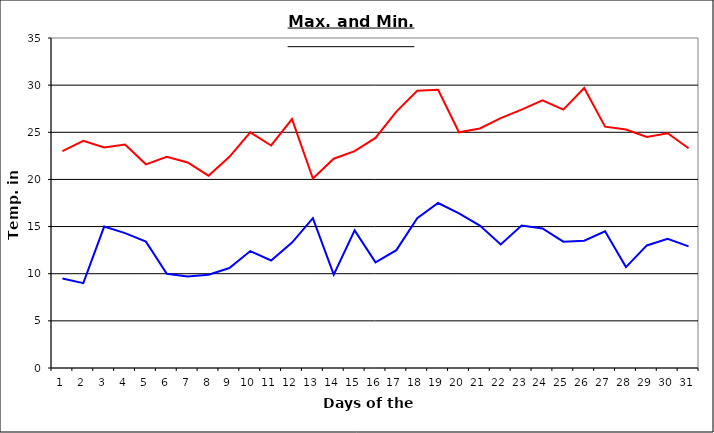
| Category | Series 0 | Series 1 |
|---|---|---|
| 0 | 23 | 9.5 |
| 1 | 24.1 | 9 |
| 2 | 23.4 | 15 |
| 3 | 23.7 | 14.3 |
| 4 | 21.6 | 13.4 |
| 5 | 22.4 | 10 |
| 6 | 21.8 | 9.7 |
| 7 | 20.4 | 9.9 |
| 8 | 22.4 | 10.6 |
| 9 | 25 | 12.4 |
| 10 | 23.6 | 11.4 |
| 11 | 26.4 | 13.3 |
| 12 | 20.1 | 15.9 |
| 13 | 22.2 | 9.9 |
| 14 | 23 | 14.6 |
| 15 | 24.4 | 11.2 |
| 16 | 27.2 | 12.5 |
| 17 | 29.4 | 15.9 |
| 18 | 29.5 | 17.5 |
| 19 | 25 | 16.4 |
| 20 | 25.4 | 15.1 |
| 21 | 26.5 | 13.1 |
| 22 | 27.4 | 15.1 |
| 23 | 28.4 | 14.8 |
| 24 | 27.4 | 13.4 |
| 25 | 29.7 | 13.5 |
| 26 | 25.6 | 14.5 |
| 27 | 25.3 | 10.7 |
| 28 | 24.5 | 13 |
| 29 | 24.9 | 13.7 |
| 30 | 23.3 | 12.9 |